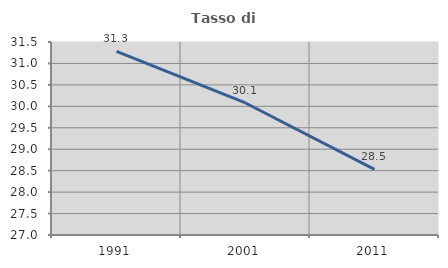
| Category | Tasso di occupazione   |
|---|---|
| 1991.0 | 31.284 |
| 2001.0 | 30.078 |
| 2011.0 | 28.53 |